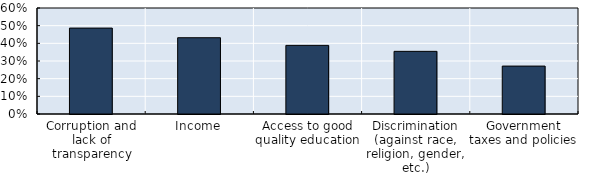
| Category | Series 0 |
|---|---|
| Corruption and lack of transparency | 0.486 |
| Income | 0.432 |
| Access to good quality education | 0.388 |
| Discrimination (against race, religion, gender, etc.) | 0.355 |
| Government taxes and policies | 0.271 |